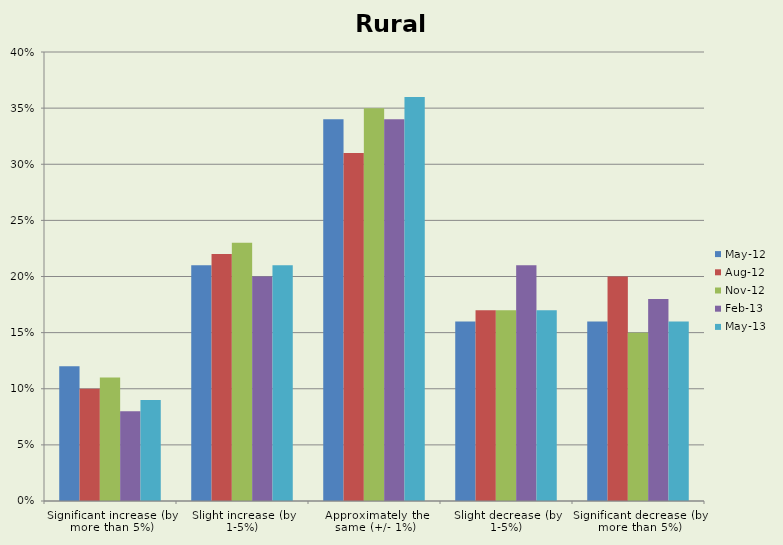
| Category | May-12 | Aug-12 | Nov-12 | Feb-13 | May-13 |
|---|---|---|---|---|---|
| Significant increase (by more than 5%) | 0.12 | 0.1 | 0.11 | 0.08 | 0.09 |
| Slight increase (by 1-5%) | 0.21 | 0.22 | 0.23 | 0.2 | 0.21 |
| Approximately the same (+/- 1%) | 0.34 | 0.31 | 0.35 | 0.34 | 0.36 |
| Slight decrease (by 1-5%) | 0.16 | 0.17 | 0.17 | 0.21 | 0.17 |
| Significant decrease (by more than 5%) | 0.16 | 0.2 | 0.15 | 0.18 | 0.16 |